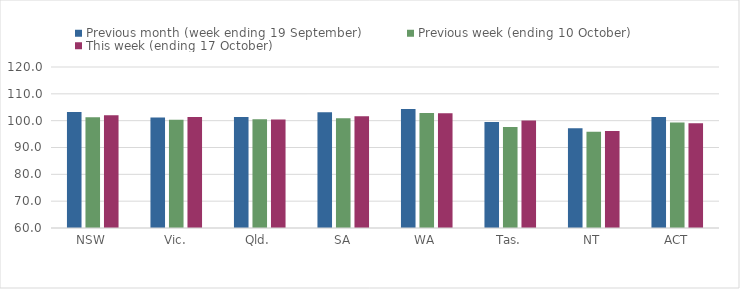
| Category | Previous month (week ending 19 September) | Previous week (ending 10 October) | This week (ending 17 October) |
|---|---|---|---|
| NSW | 103.23 | 101.23 | 102.05 |
| Vic. | 101.19 | 100.3 | 101.35 |
| Qld. | 101.38 | 100.49 | 100.43 |
| SA | 103.15 | 100.93 | 101.69 |
| WA | 104.37 | 102.9 | 102.75 |
| Tas. | 99.53 | 97.63 | 100.06 |
| NT | 97.2 | 95.91 | 96.17 |
| ACT | 101.33 | 99.28 | 99.07 |